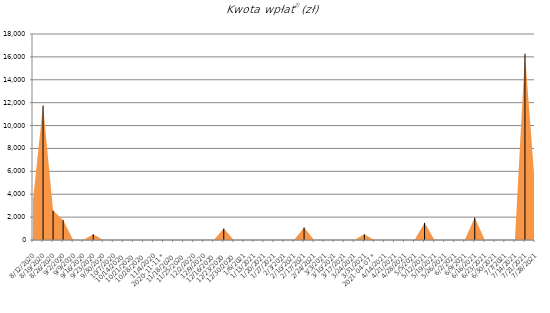
| Category | Kwota wpłat 2) (zł) |
|---|---|
| 2020-08-12 | 3500 |
| 2020-08-19 | 11750 |
| 2020-08-26 | 2567 |
| 2020-09-02 | 1740 |
| 2020-09-09 | 0 |
| 2020-09-16 | 0 |
| 2020-09-23 | 500 |
| 2020-09-30 | 0 |
| 2020-10-07 | 0 |
| 2020-10-14 | 0 |
| 2020-10-21 | 0 |
| 2020-10-28 | 0 |
| 2020-11-04 | 0 |
|    2020-11-11 * | 0 |
| 2020-11-18 | 0 |
| 2020-11-25 | 0 |
| 2020-12-02 | 0 |
| 2020-12-09 | 0 |
| 2020-12-16 | 0 |
| 2020-12-23 | 1000 |
| 2020-12-30 | 0 |
| 2021-01-06 | 0 |
| 2021-01-13 | 0 |
| 2021-01-20 | 0 |
| 2021-01-27 | 0 |
| 2021-02-03 | 0 |
| 2021-02-10 | 0 |
| 2021-02-17 | 1100 |
| 2021-02-24 | 0 |
| 2021-03-03 | 0 |
| 2021-03-10 | 0 |
| 2021-03-17 | 0 |
| 2021-03-24 | 0 |
| 2021-03-31 | 500 |
|    2021-04-07 * | 0 |
| 2021-04-14 | 0 |
| 2021-04-21 | 0 |
| 2021-04-28 | 0 |
| 2021-05-05 | 0 |
| 2021-05-12 | 1500 |
| 2021-05-19 | 0 |
| 2021-05-26 | 0 |
| 2021-06-02 | 0 |
| 2021-06-09 | 0 |
| 2021-06-16 | 1960 |
| 2021-06-23 | 0 |
| 2021-06-30 | 0 |
| 2021-07-07 | 0 |
| 2021-07-14 | 0 |
| 2021-07-21 | 16279 |
| 2021-07-28 | 4680 |